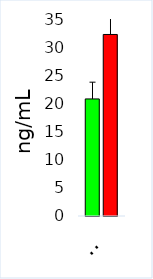
| Category | Control | ASD |
|---|---|---|
| CoQ10 | 20.799 | 32.249 |